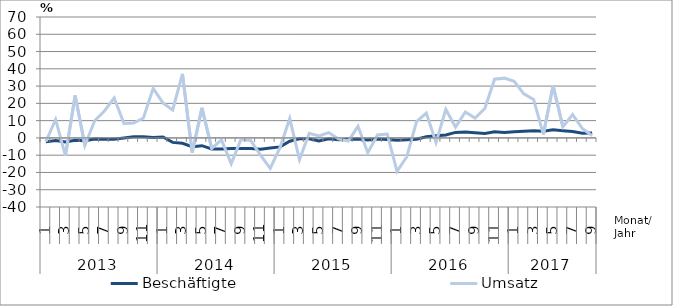
| Category | Beschäftigte | Umsatz |
|---|---|---|
| 0 | -2.3 | -2.2 |
| 1 | -1.5 | 10.7 |
| 2 | -2.4 | -10.3 |
| 3 | -1.3 | 24.6 |
| 4 | -1.6 | -4.4 |
| 5 | -0.7 | 9.9 |
| 6 | -0.8 | 15.6 |
| 7 | -0.8 | 23.1 |
| 8 | 0 | 8.4 |
| 9 | 0.7 | 8.6 |
| 10 | 0.6 | 11.5 |
| 11 | 0.3 | 28.7 |
| 12 | 0.5 | 20.3 |
| 13 | -2.6 | 16.2 |
| 14 | -3.1 | 37.1 |
| 15 | -5.1 | -8.5 |
| 16 | -4.5 | 17.4 |
| 17 | -6.4 | -6.1 |
| 18 | -6.4 | -1.1 |
| 19 | -6.2 | -14.9 |
| 20 | -6.1 | -0.9 |
| 21 | -6.1 | -1.5 |
| 22 | -6.6 | -10 |
| 23 | -5.8 | -17.6 |
| 24 | -5.2 | -5.7 |
| 25 | -1.9 | 11.2 |
| 26 | -0.5 | -12.5 |
| 27 | -0.5 | 2.7 |
| 28 | -1.7 | 1.2 |
| 29 | -0.5 | 3.1 |
| 30 | -1.1 | -0.6 |
| 31 | -0.8 | -1.8 |
| 32 | -0.6 | 6.7 |
| 33 | -1.2 | -8.6 |
| 34 | -0.6 | 1.7 |
| 35 | -0.9 | 2.2 |
| 36 | -1.3 | -19.4 |
| 37 | -1.1 | -10.9 |
| 38 | -0.8 | 9.4 |
| 39 | 0.7 | 14.4 |
| 40 | 1.2 | -2.6 |
| 41 | 1.7 | 16.5 |
| 42 | 3.2 | 6.3 |
| 43 | 3.4 | 15 |
| 44 | 3 | 11.5 |
| 45 | 2.5 | 17 |
| 46 | 3.6 | 34 |
| 47 | 3.2 | 34.6 |
| 48 | 3.5 | 32.8 |
| 49 | 3.8 | 25.5 |
| 50 | 4.2 | 22.3 |
| 51 | 3.9 | 2 |
| 52 | 4.7 | 30.3 |
| 53 | 4.2 | 6.4 |
| 54 | 3.7 | 13.5 |
| 55 | 2.7 | 5.4 |
| 56 | 2.9 | 1.3 |